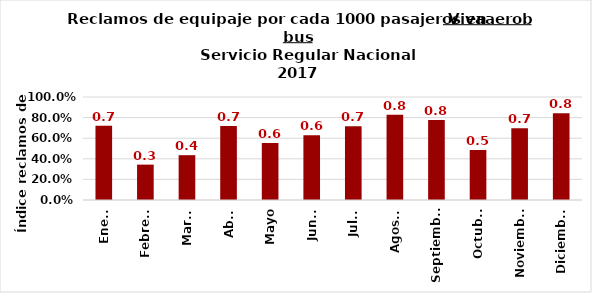
| Category | Reclamos por cada 1000 pasajeros |
|---|---|
| Enero | 0.722 |
| Febrero | 0.343 |
| Marzo | 0.435 |
| Abril | 0.719 |
| Mayo | 0.554 |
| Junio | 0.628 |
| Julio | 0.715 |
| Agosto | 0.828 |
| Septiembre | 0.777 |
| Octubre | 0.485 |
| Noviembre | 0.696 |
| Diciembre | 0.842 |